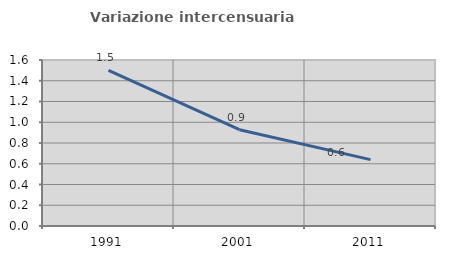
| Category | Variazione intercensuaria annua |
|---|---|
| 1991.0 | 1.501 |
| 2001.0 | 0.928 |
| 2011.0 | 0.64 |